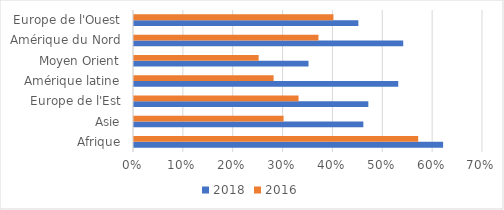
| Category | 2018 | 2016 |
|---|---|---|
| Afrique | 0.62 | 0.57 |
| Asie | 0.46 | 0.3 |
| Europe de l'Est | 0.47 | 0.33 |
| Amérique latine | 0.53 | 0.28 |
| Moyen Orient | 0.35 | 0.25 |
| Amérique du Nord | 0.54 | 0.37 |
| Europe de l'Ouest | 0.45 | 0.4 |